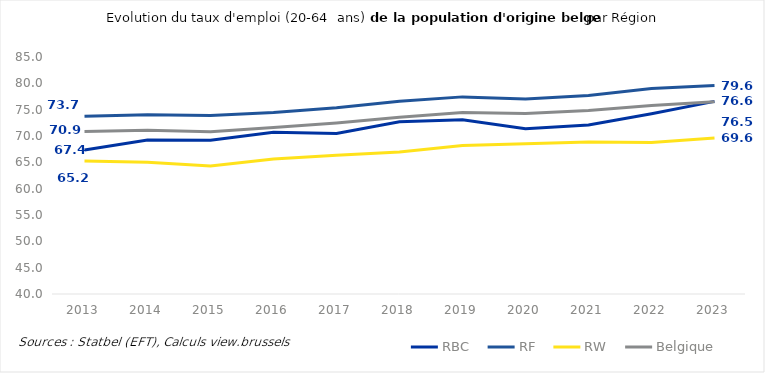
| Category | RBC | RF | RW | Belgique |
|---|---|---|---|---|
| 2013.0 | 67.351 | 73.733 | 65.243 | 70.872 |
| 2014.0 | 69.247 | 74.049 | 65.028 | 71.075 |
| 2015.0 | 69.209 | 73.872 | 64.316 | 70.796 |
| 2016.0 | 70.706 | 74.457 | 65.649 | 71.604 |
| 2017.0 | 70.471 | 75.372 | 66.365 | 72.457 |
| 2018.0 | 72.708 | 76.591 | 66.975 | 73.543 |
| 2019.0 | 73.097 | 77.428 | 68.185 | 74.479 |
| 2020.0 | 71.393 | 77.044 | 68.516 | 74.271 |
| 2021.0 | 72.108 | 77.698 | 68.883 | 74.833 |
| 2022.0 | 74.209 | 79.033 | 68.782 | 75.776 |
| 2023.0 | 76.58 | 79.572 | 69.598 | 76.482 |